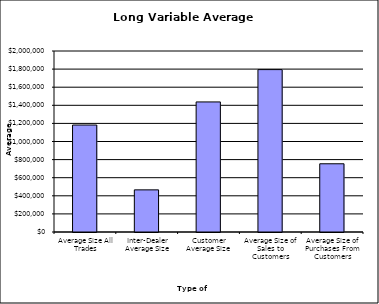
| Category | Security Type |
|---|---|
| Average Size All Trades | 1181999.032 |
| Inter-Dealer Average Size | 465636.811 |
| Customer Average Size | 1437327.129 |
| Average Size of Sales to Customers | 1794464.799 |
| Average Size of Purchases From Customers | 753850.818 |